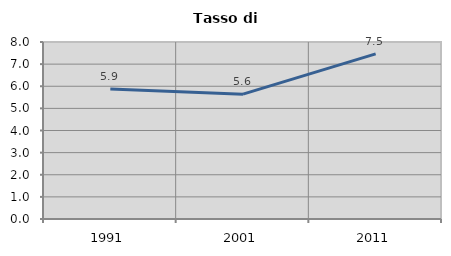
| Category | Tasso di disoccupazione   |
|---|---|
| 1991.0 | 5.877 |
| 2001.0 | 5.644 |
| 2011.0 | 7.464 |